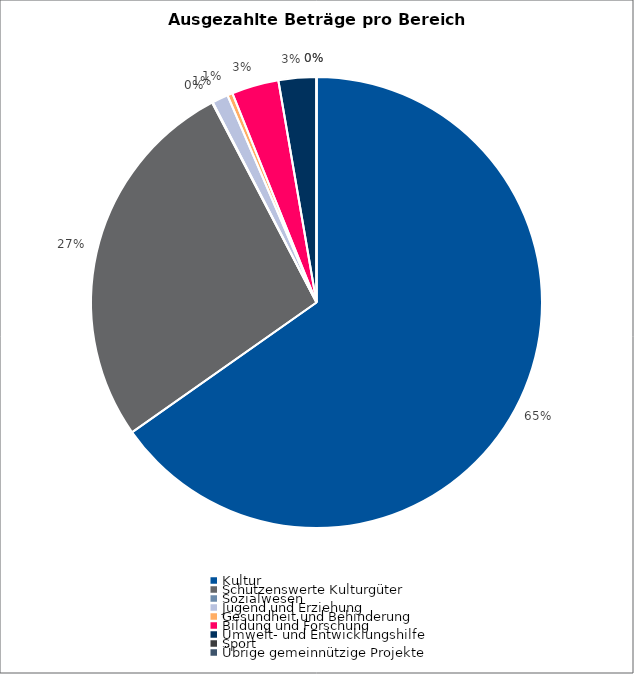
| Category | Series 0 |
|---|---|
| Kultur | 6019392 |
| Schützenswerte Kulturgüter | 2500000 |
| Sozialwesen | 5000 |
| Jugend und Erziehung | 106000 |
| Gesundheit und Behinderung | 35000 |
| Bildung und Forschung | 310995 |
| Umwelt- und Entwicklungshilfe | 250000 |
| Sport | 0 |
| Übrige gemeinnützige Projekte | 0 |